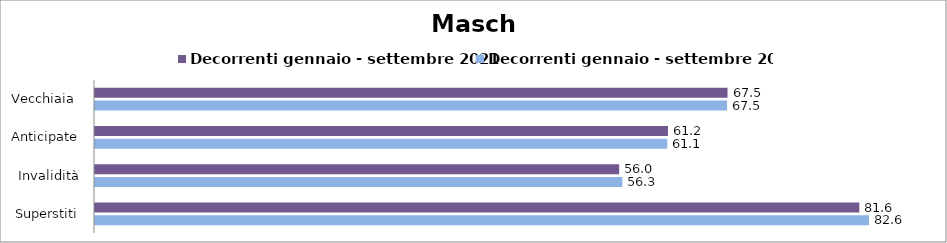
| Category | Decorrenti gennaio - settembre 2021 | Decorrenti gennaio - settembre 2022 |
|---|---|---|
| Vecchiaia  | 67.53 | 67.48 |
| Anticipate | 61.17 | 61.1 |
| Invalidità | 55.96 | 56.3 |
| Superstiti | 81.6 | 82.63 |